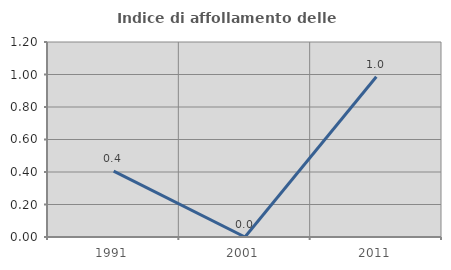
| Category | Indice di affollamento delle abitazioni  |
|---|---|
| 1991.0 | 0.406 |
| 2001.0 | 0 |
| 2011.0 | 0.986 |